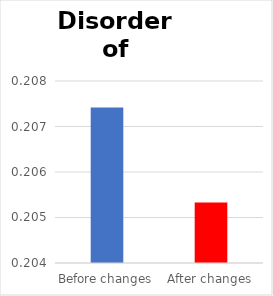
| Category | Series 0 |
|---|---|
| Before changes | 0.207 |
| After changes | 0.205 |